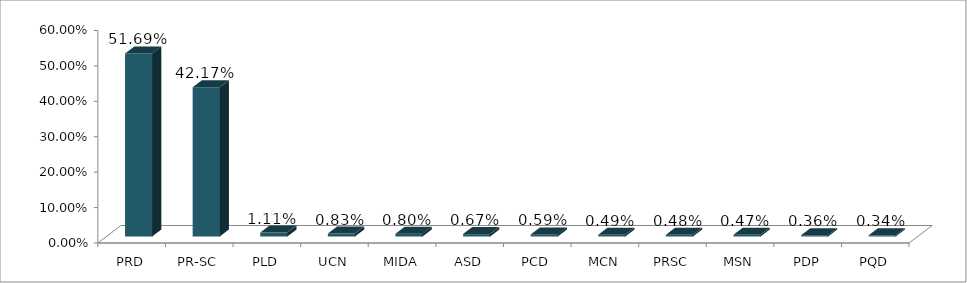
| Category | Votos % |
|---|---|
| PRD | 0.517 |
| PR-SC | 0.422 |
| PLD | 0.011 |
| UCN | 0.008 |
| MIDA | 0.008 |
| ASD | 0.007 |
| PCD | 0.006 |
| MCN | 0.005 |
| PRSC | 0.005 |
| MSN | 0.005 |
| PDP | 0.004 |
| PQD | 0.003 |